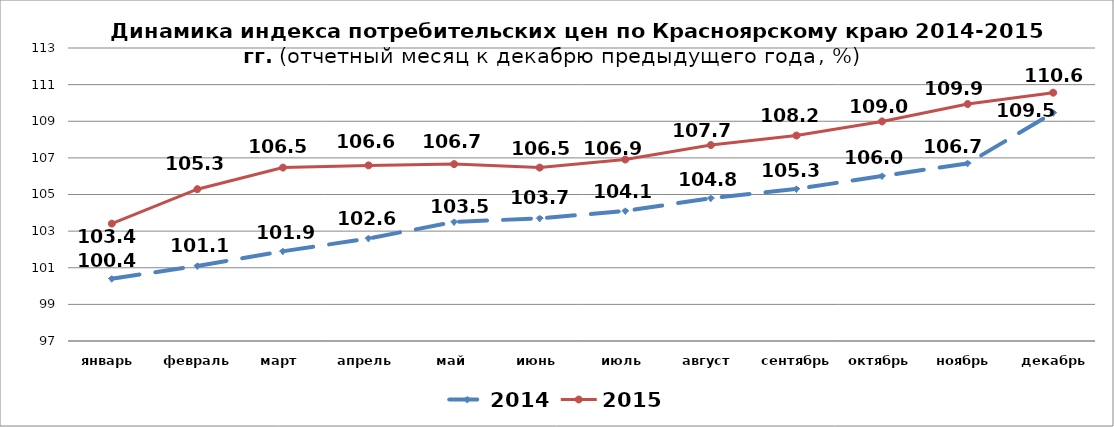
| Category | 2014 | 2015 |
|---|---|---|
| январь | 100.4 | 103.41 |
| февраль | 101.1 | 105.29 |
| март | 101.9 | 106.47 |
| апрель | 102.6 | 106.59 |
| май | 103.5 | 106.66 |
| июнь | 103.7 | 106.47 |
| июль | 104.1 | 106.91 |
| август | 104.8 | 107.7 |
| сентябрь | 105.3 | 108.22 |
| октябрь | 106.01 | 108.99 |
| ноябрь | 106.7 | 109.94 |
| декабрь | 109.46 | 110.56 |